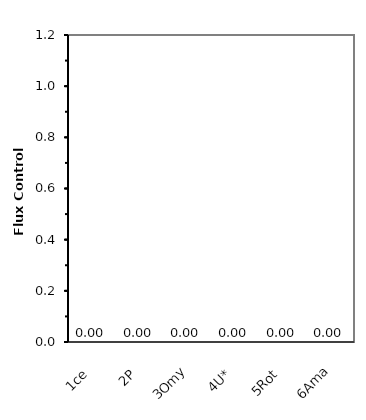
| Category | Flux Control Ratio |
|---|---|
| 1ce | 0 |
| 2P | 0 |
| 3Omy | 0 |
| 4U* | 0 |
| 5Rot | 0 |
| 6Ama | 0 |